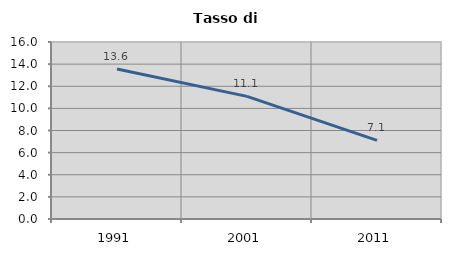
| Category | Tasso di disoccupazione   |
|---|---|
| 1991.0 | 13.561 |
| 2001.0 | 11.087 |
| 2011.0 | 7.109 |